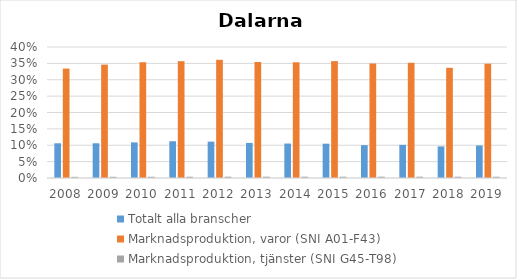
| Category | Totalt alla branscher | Marknadsproduktion, varor (SNI A01-F43) | Marknadsproduktion, tjänster (SNI G45-T98) |
|---|---|---|---|
| 2008.0 | 0.106 | 0.334 | 0.004 |
| 2009.0 | 0.106 | 0.346 | 0.004 |
| 2010.0 | 0.109 | 0.353 | 0.004 |
| 2011.0 | 0.112 | 0.357 | 0.004 |
| 2012.0 | 0.111 | 0.361 | 0.004 |
| 2013.0 | 0.107 | 0.354 | 0.004 |
| 2014.0 | 0.105 | 0.353 | 0.004 |
| 2015.0 | 0.105 | 0.357 | 0.004 |
| 2016.0 | 0.1 | 0.35 | 0.004 |
| 2017.0 | 0.101 | 0.352 | 0.004 |
| 2018.0 | 0.096 | 0.336 | 0.004 |
| 2019.0 | 0.099 | 0.349 | 0.004 |